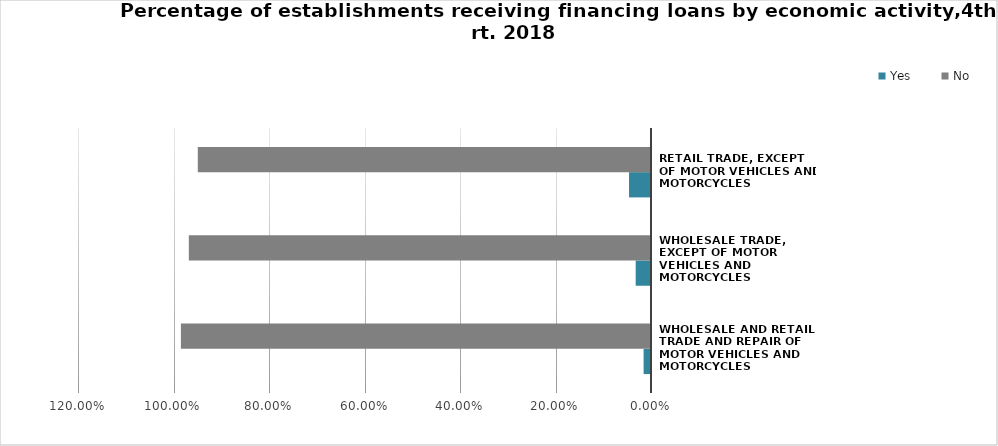
| Category | Yes | No |
|---|---|---|
| Wholesale and retail trade and repair of motor vehicles and motorcycles | 0.016 | 0.984 |
| Wholesale trade, except of motor vehicles and motorcycles | 0.032 | 0.968 |
| Retail trade, except of motor vehicles and motorcycles | 0.046 | 0.949 |